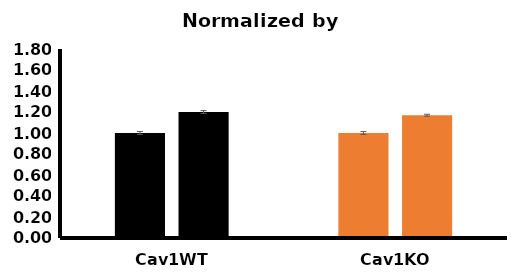
| Category | Control | Rab11 124 I DN |
|---|---|---|
| Cav1WT | 1 | 1.2 |
| Cav1KO | 1 | 1.169 |